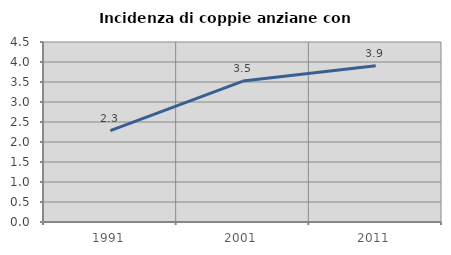
| Category | Incidenza di coppie anziane con figli |
|---|---|
| 1991.0 | 2.286 |
| 2001.0 | 3.523 |
| 2011.0 | 3.904 |